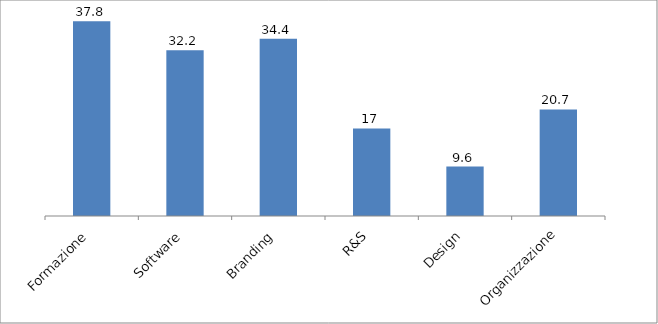
| Category | Series 0 |
|---|---|
| Formazione | 37.8 |
| Software | 32.2 |
| Branding | 34.4 |
| R&S | 17 |
| Design | 9.6 |
| Organizzazione | 20.7 |